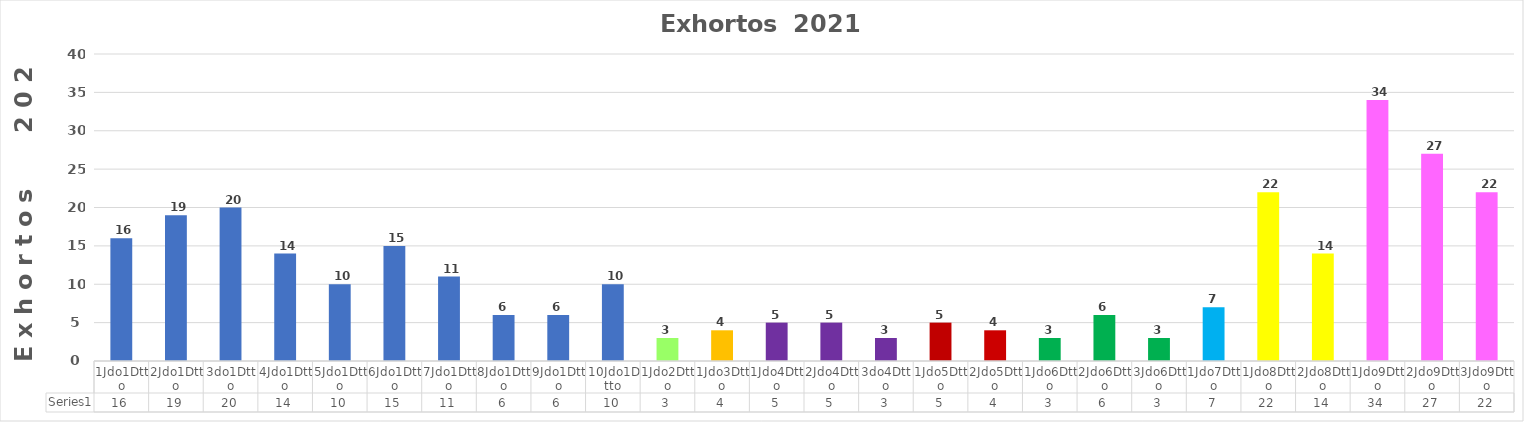
| Category | Series 0 |
|---|---|
| 1Jdo1Dtto | 16 |
| 2Jdo1Dtto | 19 |
| 3do1Dtto | 20 |
| 4Jdo1Dtto | 14 |
| 5Jdo1Dtto | 10 |
| 6Jdo1Dtto | 15 |
| 7Jdo1Dtto | 11 |
| 8Jdo1Dtto | 6 |
| 9Jdo1Dtto | 6 |
| 10Jdo1Dtto | 10 |
| 1Jdo2Dtto | 3 |
| 1Jdo3Dtto | 4 |
| 1Jdo4Dtto | 5 |
| 2Jdo4Dtto | 5 |
| 3do4Dtto | 3 |
| 1Jdo5Dtto | 5 |
| 2Jdo5Dtto | 4 |
| 1Jdo6Dtto | 3 |
| 2Jdo6Dtto | 6 |
| 3Jdo6Dtto | 3 |
| 1Jdo7Dtto | 7 |
| 1Jdo8Dtto | 22 |
| 2Jdo8Dtto | 14 |
| 1Jdo9Dtto | 34 |
| 2Jdo9Dtto | 27 |
| 3Jdo9Dtto | 22 |